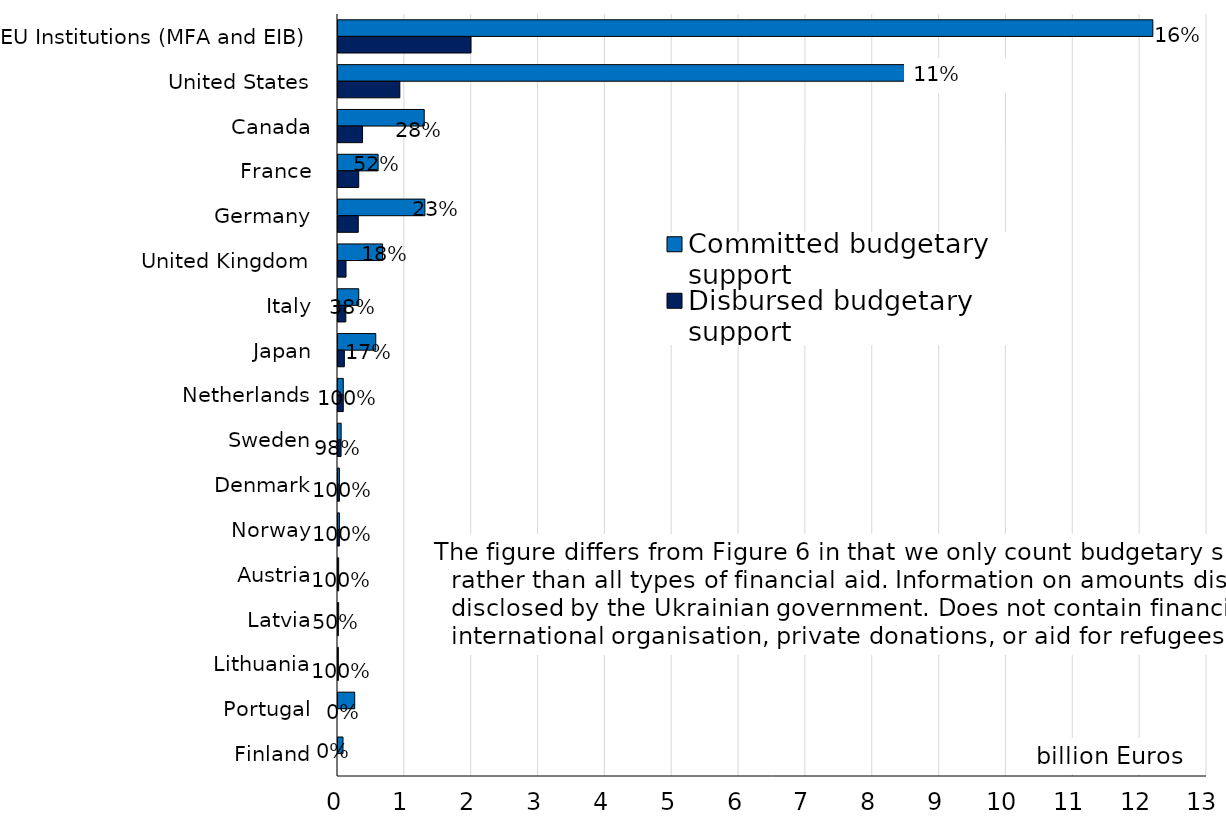
| Category | Committed budgetary support | Disbursed budgetary support |
|---|---|---|
| EU Institutions (MFA and EIB) | 12.19 | 1.99 |
| United States | 8.477 | 0.925 |
| Canada | 1.29 | 0.367 |
| France | 0.6 | 0.31 |
| Germany | 1.3 | 0.303 |
| United Kingdom | 0.666 | 0.12 |
| Italy | 0.31 | 0.117 |
| Japan | 0.565 | 0.095 |
| Netherlands | 0.079 | 0.079 |
| Sweden | 0.047 | 0.046 |
| Denmark | 0.021 | 0.021 |
| Norway | 0.021 | 0.021 |
| Austria | 0.01 | 0.01 |
| Latvia | 0.01 | 0.005 |
| Lithuania | 0.005 | 0.005 |
| Portugal | 0.25 | 0 |
| Finland | 0.075 | 0 |